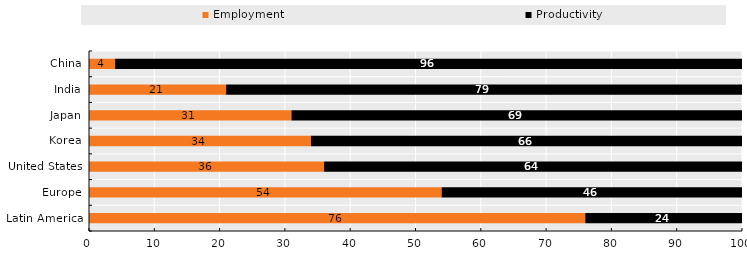
| Category | Employment | Productivity |
|---|---|---|
| China | 4 | 96 |
| India | 21 | 79 |
| Japan | 31 | 69 |
| Korea | 34 | 66 |
| United States | 36 | 64 |
| Europe | 54 | 46 |
| Latin America | 76 | 24 |